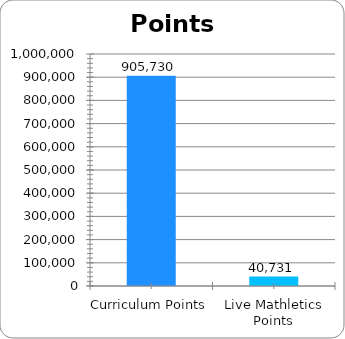
| Category | Series 0 |
|---|---|
| Curriculum Points | 905730 |
| Live Mathletics Points | 40731 |